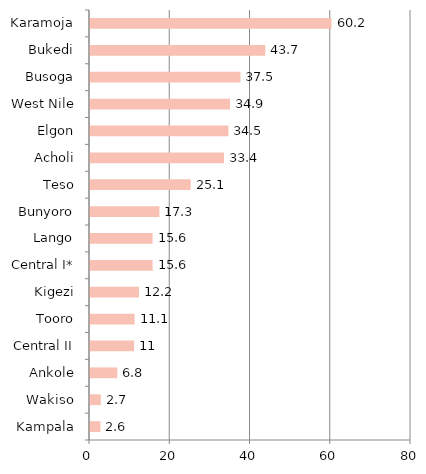
| Category | Series 0 |
|---|---|
| Kampala | 2.6 |
| Wakiso | 2.7 |
| Ankole | 6.8 |
| Central II | 11 |
| Tooro | 11.1 |
| Kigezi | 12.2 |
| Central I* | 15.6 |
| Lango | 15.6 |
| Bunyoro | 17.3 |
| Teso | 25.1 |
| Acholi | 33.4 |
| Elgon | 34.5 |
| West Nile | 34.9 |
| Busoga | 37.5 |
| Bukedi | 43.7 |
| Karamoja | 60.2 |